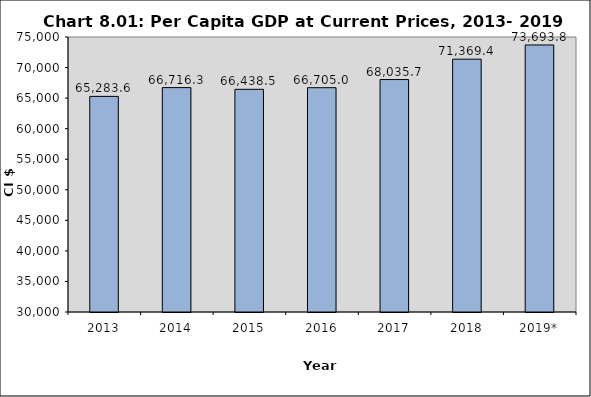
| Category | Series 0 |
|---|---|
| 2013 | 65283.559 |
| 2014 | 66716.312 |
| 2015 | 66438.463 |
| 2016 | 66705 |
| 2017 | 68035.7 |
| 2018 | 71369.4 |
| 2019* | 73693.8 |